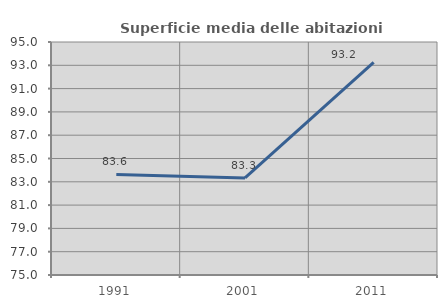
| Category | Superficie media delle abitazioni occupate |
|---|---|
| 1991.0 | 83.634 |
| 2001.0 | 83.333 |
| 2011.0 | 93.248 |